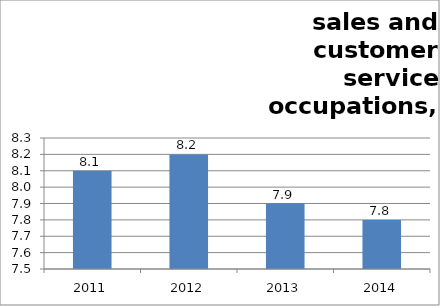
| Category | 7: Sales & customer service  |
|---|---|
| 2011.0 | 8.1 |
| 2012.0 | 8.2 |
| 2013.0 | 7.9 |
| 2014.0 | 7.8 |